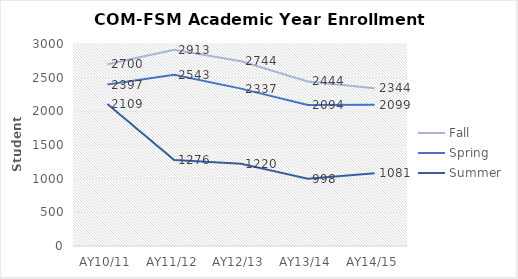
| Category | Fall | Spring | Summer |
|---|---|---|---|
| AY10/11 | 2700 | 2397 | 2109 |
| AY11/12 | 2913 | 2543 | 1276 |
| AY12/13 | 2744 | 2337 | 1220 |
| AY13/14 | 2444 | 2094 | 998 |
| AY14/15 | 2344 | 2099 | 1081 |